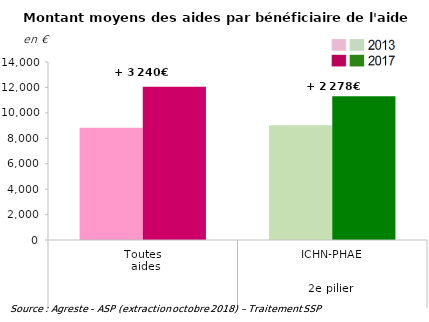
| Category | 2013 | 2017 |
|---|---|---|
| 0 | 8819.142 | 12058.804 |
| 1 | 9029.406 | 11307.288 |